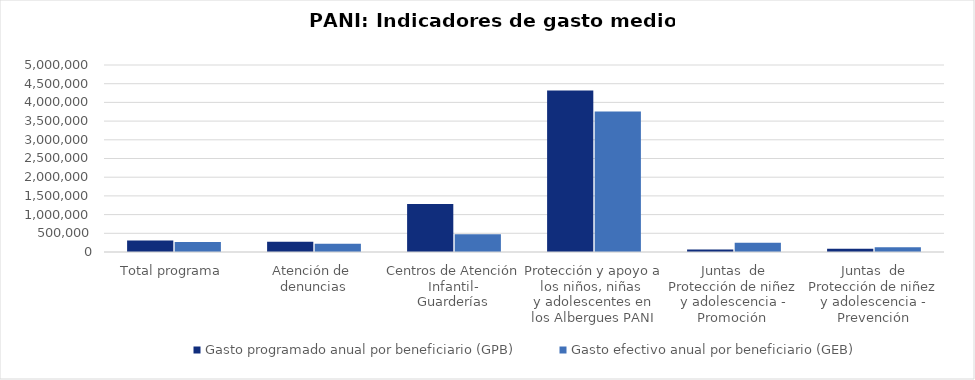
| Category | Gasto programado anual por beneficiario (GPB)  | Gasto efectivo anual por beneficiario (GEB)  |
|---|---|---|
| Total programa | 310285.778 | 270183.581 |
| Atención de 
denuncias | 276499.8 | 222674.702 |
| Centros de Atención Infantil-
Guarderías | 1280405.4 | 474505.528 |
| Protección y apoyo a los niños, niñas 
y adolescentes en los Albergues PANI | 4318805.285 | 3757703.365 |
| Juntas  de Protección de niñez y adolescencia - Promoción  | 65974.56 | 249485.973 |
| Juntas  de Protección de niñez y adolescencia - Prevención | 88641.06 | 127099.039 |